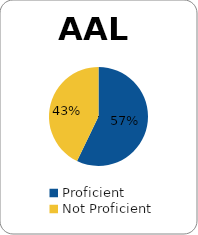
| Category | Series 0 |
|---|---|
| Proficient | 0.571 |
| Not Proficient | 0.429 |